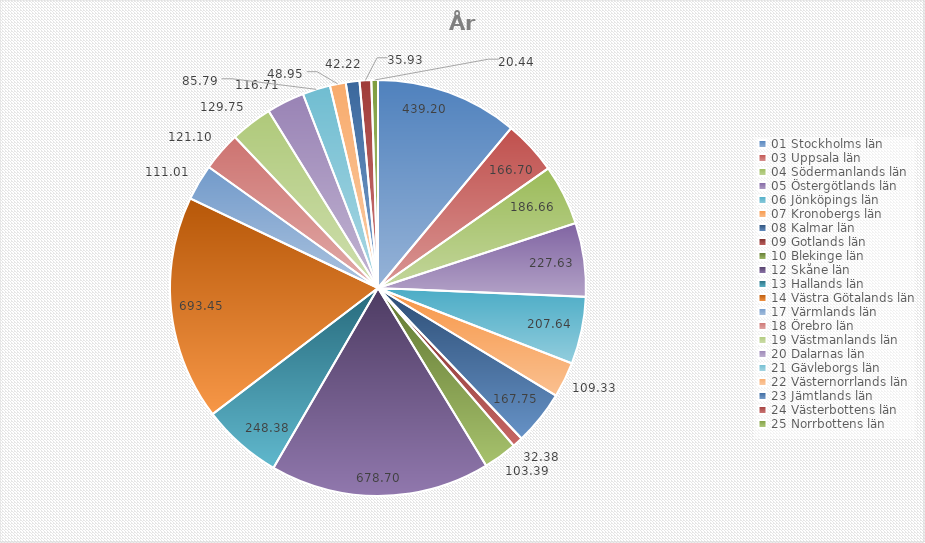
| Category | Series 0 |
|---|---|
| 01 Stockholms län | 439.2 |
| 03 Uppsala län | 166.7 |
| 04 Södermanlands län | 186.66 |
| 05 Östergötlands län | 227.63 |
| 06 Jönköpings län | 207.64 |
| 07 Kronobergs län | 109.33 |
| 08 Kalmar län | 167.75 |
| 09 Gotlands län | 32.38 |
| 10 Blekinge län | 103.39 |
| 12 Skåne län | 678.7 |
| 13 Hallands län | 248.38 |
| 14 Västra Götalands län | 693.45 |
| 17 Värmlands län | 111.01 |
| 18 Örebro län | 121.1 |
| 19 Västmanlands län | 129.75 |
| 20 Dalarnas län | 116.71 |
| 21 Gävleborgs län | 85.79 |
| 22 Västernorrlands län | 48.95 |
| 23 Jämtlands län | 42.22 |
| 24 Västerbottens län | 35.93 |
| 25 Norrbottens län | 20.44 |